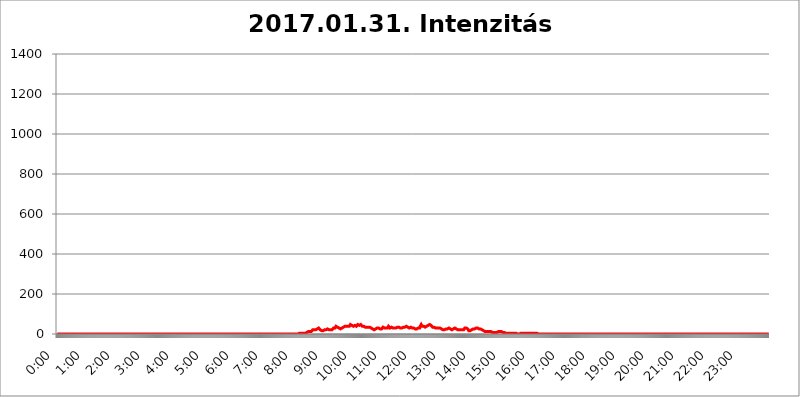
| Category | 2017.01.31. Intenzitás [W/m^2] |
|---|---|
| 0.0 | 0 |
| 0.0006944444444444445 | 0 |
| 0.001388888888888889 | 0 |
| 0.0020833333333333333 | 0 |
| 0.002777777777777778 | 0 |
| 0.003472222222222222 | 0 |
| 0.004166666666666667 | 0 |
| 0.004861111111111111 | 0 |
| 0.005555555555555556 | 0 |
| 0.0062499999999999995 | 0 |
| 0.006944444444444444 | 0 |
| 0.007638888888888889 | 0 |
| 0.008333333333333333 | 0 |
| 0.009027777777777779 | 0 |
| 0.009722222222222222 | 0 |
| 0.010416666666666666 | 0 |
| 0.011111111111111112 | 0 |
| 0.011805555555555555 | 0 |
| 0.012499999999999999 | 0 |
| 0.013194444444444444 | 0 |
| 0.013888888888888888 | 0 |
| 0.014583333333333332 | 0 |
| 0.015277777777777777 | 0 |
| 0.015972222222222224 | 0 |
| 0.016666666666666666 | 0 |
| 0.017361111111111112 | 0 |
| 0.018055555555555557 | 0 |
| 0.01875 | 0 |
| 0.019444444444444445 | 0 |
| 0.02013888888888889 | 0 |
| 0.020833333333333332 | 0 |
| 0.02152777777777778 | 0 |
| 0.022222222222222223 | 0 |
| 0.02291666666666667 | 0 |
| 0.02361111111111111 | 0 |
| 0.024305555555555556 | 0 |
| 0.024999999999999998 | 0 |
| 0.025694444444444447 | 0 |
| 0.02638888888888889 | 0 |
| 0.027083333333333334 | 0 |
| 0.027777777777777776 | 0 |
| 0.02847222222222222 | 0 |
| 0.029166666666666664 | 0 |
| 0.029861111111111113 | 0 |
| 0.030555555555555555 | 0 |
| 0.03125 | 0 |
| 0.03194444444444445 | 0 |
| 0.03263888888888889 | 0 |
| 0.03333333333333333 | 0 |
| 0.034027777777777775 | 0 |
| 0.034722222222222224 | 0 |
| 0.035416666666666666 | 0 |
| 0.036111111111111115 | 0 |
| 0.03680555555555556 | 0 |
| 0.0375 | 0 |
| 0.03819444444444444 | 0 |
| 0.03888888888888889 | 0 |
| 0.03958333333333333 | 0 |
| 0.04027777777777778 | 0 |
| 0.04097222222222222 | 0 |
| 0.041666666666666664 | 0 |
| 0.042361111111111106 | 0 |
| 0.04305555555555556 | 0 |
| 0.043750000000000004 | 0 |
| 0.044444444444444446 | 0 |
| 0.04513888888888889 | 0 |
| 0.04583333333333334 | 0 |
| 0.04652777777777778 | 0 |
| 0.04722222222222222 | 0 |
| 0.04791666666666666 | 0 |
| 0.04861111111111111 | 0 |
| 0.049305555555555554 | 0 |
| 0.049999999999999996 | 0 |
| 0.05069444444444445 | 0 |
| 0.051388888888888894 | 0 |
| 0.052083333333333336 | 0 |
| 0.05277777777777778 | 0 |
| 0.05347222222222222 | 0 |
| 0.05416666666666667 | 0 |
| 0.05486111111111111 | 0 |
| 0.05555555555555555 | 0 |
| 0.05625 | 0 |
| 0.05694444444444444 | 0 |
| 0.057638888888888885 | 0 |
| 0.05833333333333333 | 0 |
| 0.05902777777777778 | 0 |
| 0.059722222222222225 | 0 |
| 0.06041666666666667 | 0 |
| 0.061111111111111116 | 0 |
| 0.06180555555555556 | 0 |
| 0.0625 | 0 |
| 0.06319444444444444 | 0 |
| 0.06388888888888888 | 0 |
| 0.06458333333333334 | 0 |
| 0.06527777777777778 | 0 |
| 0.06597222222222222 | 0 |
| 0.06666666666666667 | 0 |
| 0.06736111111111111 | 0 |
| 0.06805555555555555 | 0 |
| 0.06874999999999999 | 0 |
| 0.06944444444444443 | 0 |
| 0.07013888888888889 | 0 |
| 0.07083333333333333 | 0 |
| 0.07152777777777779 | 0 |
| 0.07222222222222223 | 0 |
| 0.07291666666666667 | 0 |
| 0.07361111111111111 | 0 |
| 0.07430555555555556 | 0 |
| 0.075 | 0 |
| 0.07569444444444444 | 0 |
| 0.0763888888888889 | 0 |
| 0.07708333333333334 | 0 |
| 0.07777777777777778 | 0 |
| 0.07847222222222222 | 0 |
| 0.07916666666666666 | 0 |
| 0.0798611111111111 | 0 |
| 0.08055555555555556 | 0 |
| 0.08125 | 0 |
| 0.08194444444444444 | 0 |
| 0.08263888888888889 | 0 |
| 0.08333333333333333 | 0 |
| 0.08402777777777777 | 0 |
| 0.08472222222222221 | 0 |
| 0.08541666666666665 | 0 |
| 0.08611111111111112 | 0 |
| 0.08680555555555557 | 0 |
| 0.08750000000000001 | 0 |
| 0.08819444444444445 | 0 |
| 0.08888888888888889 | 0 |
| 0.08958333333333333 | 0 |
| 0.09027777777777778 | 0 |
| 0.09097222222222222 | 0 |
| 0.09166666666666667 | 0 |
| 0.09236111111111112 | 0 |
| 0.09305555555555556 | 0 |
| 0.09375 | 0 |
| 0.09444444444444444 | 0 |
| 0.09513888888888888 | 0 |
| 0.09583333333333333 | 0 |
| 0.09652777777777777 | 0 |
| 0.09722222222222222 | 0 |
| 0.09791666666666667 | 0 |
| 0.09861111111111111 | 0 |
| 0.09930555555555555 | 0 |
| 0.09999999999999999 | 0 |
| 0.10069444444444443 | 0 |
| 0.1013888888888889 | 0 |
| 0.10208333333333335 | 0 |
| 0.10277777777777779 | 0 |
| 0.10347222222222223 | 0 |
| 0.10416666666666667 | 0 |
| 0.10486111111111111 | 0 |
| 0.10555555555555556 | 0 |
| 0.10625 | 0 |
| 0.10694444444444444 | 0 |
| 0.1076388888888889 | 0 |
| 0.10833333333333334 | 0 |
| 0.10902777777777778 | 0 |
| 0.10972222222222222 | 0 |
| 0.1111111111111111 | 0 |
| 0.11180555555555556 | 0 |
| 0.11180555555555556 | 0 |
| 0.1125 | 0 |
| 0.11319444444444444 | 0 |
| 0.11388888888888889 | 0 |
| 0.11458333333333333 | 0 |
| 0.11527777777777777 | 0 |
| 0.11597222222222221 | 0 |
| 0.11666666666666665 | 0 |
| 0.1173611111111111 | 0 |
| 0.11805555555555557 | 0 |
| 0.11944444444444445 | 0 |
| 0.12013888888888889 | 0 |
| 0.12083333333333333 | 0 |
| 0.12152777777777778 | 0 |
| 0.12222222222222223 | 0 |
| 0.12291666666666667 | 0 |
| 0.12291666666666667 | 0 |
| 0.12361111111111112 | 0 |
| 0.12430555555555556 | 0 |
| 0.125 | 0 |
| 0.12569444444444444 | 0 |
| 0.12638888888888888 | 0 |
| 0.12708333333333333 | 0 |
| 0.16875 | 0 |
| 0.12847222222222224 | 0 |
| 0.12916666666666668 | 0 |
| 0.12986111111111112 | 0 |
| 0.13055555555555556 | 0 |
| 0.13125 | 0 |
| 0.13194444444444445 | 0 |
| 0.1326388888888889 | 0 |
| 0.13333333333333333 | 0 |
| 0.13402777777777777 | 0 |
| 0.13402777777777777 | 0 |
| 0.13472222222222222 | 0 |
| 0.13541666666666666 | 0 |
| 0.1361111111111111 | 0 |
| 0.13749999999999998 | 0 |
| 0.13819444444444443 | 0 |
| 0.1388888888888889 | 0 |
| 0.13958333333333334 | 0 |
| 0.14027777777777778 | 0 |
| 0.14097222222222222 | 0 |
| 0.14166666666666666 | 0 |
| 0.1423611111111111 | 0 |
| 0.14305555555555557 | 0 |
| 0.14375000000000002 | 0 |
| 0.14444444444444446 | 0 |
| 0.1451388888888889 | 0 |
| 0.1451388888888889 | 0 |
| 0.14652777777777778 | 0 |
| 0.14722222222222223 | 0 |
| 0.14791666666666667 | 0 |
| 0.1486111111111111 | 0 |
| 0.14930555555555555 | 0 |
| 0.15 | 0 |
| 0.15069444444444444 | 0 |
| 0.15138888888888888 | 0 |
| 0.15208333333333332 | 0 |
| 0.15277777777777776 | 0 |
| 0.15347222222222223 | 0 |
| 0.15416666666666667 | 0 |
| 0.15486111111111112 | 0 |
| 0.15555555555555556 | 0 |
| 0.15625 | 0 |
| 0.15694444444444444 | 0 |
| 0.15763888888888888 | 0 |
| 0.15833333333333333 | 0 |
| 0.15902777777777777 | 0 |
| 0.15972222222222224 | 0 |
| 0.16041666666666668 | 0 |
| 0.16111111111111112 | 0 |
| 0.16180555555555556 | 0 |
| 0.1625 | 0 |
| 0.16319444444444445 | 0 |
| 0.1638888888888889 | 0 |
| 0.16458333333333333 | 0 |
| 0.16527777777777777 | 0 |
| 0.16597222222222222 | 0 |
| 0.16666666666666666 | 0 |
| 0.1673611111111111 | 0 |
| 0.16805555555555554 | 0 |
| 0.16874999999999998 | 0 |
| 0.16944444444444443 | 0 |
| 0.17013888888888887 | 0 |
| 0.1708333333333333 | 0 |
| 0.17152777777777775 | 0 |
| 0.17222222222222225 | 0 |
| 0.1729166666666667 | 0 |
| 0.17361111111111113 | 0 |
| 0.17430555555555557 | 0 |
| 0.17500000000000002 | 0 |
| 0.17569444444444446 | 0 |
| 0.1763888888888889 | 0 |
| 0.17708333333333334 | 0 |
| 0.17777777777777778 | 0 |
| 0.17847222222222223 | 0 |
| 0.17916666666666667 | 0 |
| 0.1798611111111111 | 0 |
| 0.18055555555555555 | 0 |
| 0.18125 | 0 |
| 0.18194444444444444 | 0 |
| 0.1826388888888889 | 0 |
| 0.18333333333333335 | 0 |
| 0.1840277777777778 | 0 |
| 0.18472222222222223 | 0 |
| 0.18541666666666667 | 0 |
| 0.18611111111111112 | 0 |
| 0.18680555555555556 | 0 |
| 0.1875 | 0 |
| 0.18819444444444444 | 0 |
| 0.18888888888888888 | 0 |
| 0.18958333333333333 | 0 |
| 0.19027777777777777 | 0 |
| 0.1909722222222222 | 0 |
| 0.19166666666666665 | 0 |
| 0.19236111111111112 | 0 |
| 0.19305555555555554 | 0 |
| 0.19375 | 0 |
| 0.19444444444444445 | 0 |
| 0.1951388888888889 | 0 |
| 0.19583333333333333 | 0 |
| 0.19652777777777777 | 0 |
| 0.19722222222222222 | 0 |
| 0.19791666666666666 | 0 |
| 0.1986111111111111 | 0 |
| 0.19930555555555554 | 0 |
| 0.19999999999999998 | 0 |
| 0.20069444444444443 | 0 |
| 0.20138888888888887 | 0 |
| 0.2020833333333333 | 0 |
| 0.2027777777777778 | 0 |
| 0.2034722222222222 | 0 |
| 0.2041666666666667 | 0 |
| 0.20486111111111113 | 0 |
| 0.20555555555555557 | 0 |
| 0.20625000000000002 | 0 |
| 0.20694444444444446 | 0 |
| 0.2076388888888889 | 0 |
| 0.20833333333333334 | 0 |
| 0.20902777777777778 | 0 |
| 0.20972222222222223 | 0 |
| 0.21041666666666667 | 0 |
| 0.2111111111111111 | 0 |
| 0.21180555555555555 | 0 |
| 0.2125 | 0 |
| 0.21319444444444444 | 0 |
| 0.2138888888888889 | 0 |
| 0.21458333333333335 | 0 |
| 0.2152777777777778 | 0 |
| 0.21597222222222223 | 0 |
| 0.21666666666666667 | 0 |
| 0.21736111111111112 | 0 |
| 0.21805555555555556 | 0 |
| 0.21875 | 0 |
| 0.21944444444444444 | 0 |
| 0.22013888888888888 | 0 |
| 0.22083333333333333 | 0 |
| 0.22152777777777777 | 0 |
| 0.2222222222222222 | 0 |
| 0.22291666666666665 | 0 |
| 0.2236111111111111 | 0 |
| 0.22430555555555556 | 0 |
| 0.225 | 0 |
| 0.22569444444444445 | 0 |
| 0.2263888888888889 | 0 |
| 0.22708333333333333 | 0 |
| 0.22777777777777777 | 0 |
| 0.22847222222222222 | 0 |
| 0.22916666666666666 | 0 |
| 0.2298611111111111 | 0 |
| 0.23055555555555554 | 0 |
| 0.23124999999999998 | 0 |
| 0.23194444444444443 | 0 |
| 0.23263888888888887 | 0 |
| 0.2333333333333333 | 0 |
| 0.2340277777777778 | 0 |
| 0.2347222222222222 | 0 |
| 0.2354166666666667 | 0 |
| 0.23611111111111113 | 0 |
| 0.23680555555555557 | 0 |
| 0.23750000000000002 | 0 |
| 0.23819444444444446 | 0 |
| 0.2388888888888889 | 0 |
| 0.23958333333333334 | 0 |
| 0.24027777777777778 | 0 |
| 0.24097222222222223 | 0 |
| 0.24166666666666667 | 0 |
| 0.2423611111111111 | 0 |
| 0.24305555555555555 | 0 |
| 0.24375 | 0 |
| 0.24444444444444446 | 0 |
| 0.24513888888888888 | 0 |
| 0.24583333333333335 | 0 |
| 0.2465277777777778 | 0 |
| 0.24722222222222223 | 0 |
| 0.24791666666666667 | 0 |
| 0.24861111111111112 | 0 |
| 0.24930555555555556 | 0 |
| 0.25 | 0 |
| 0.25069444444444444 | 0 |
| 0.2513888888888889 | 0 |
| 0.2520833333333333 | 0 |
| 0.25277777777777777 | 0 |
| 0.2534722222222222 | 0 |
| 0.25416666666666665 | 0 |
| 0.2548611111111111 | 0 |
| 0.2555555555555556 | 0 |
| 0.25625000000000003 | 0 |
| 0.2569444444444445 | 0 |
| 0.2576388888888889 | 0 |
| 0.25833333333333336 | 0 |
| 0.2590277777777778 | 0 |
| 0.25972222222222224 | 0 |
| 0.2604166666666667 | 0 |
| 0.2611111111111111 | 0 |
| 0.26180555555555557 | 0 |
| 0.2625 | 0 |
| 0.26319444444444445 | 0 |
| 0.2638888888888889 | 0 |
| 0.26458333333333334 | 0 |
| 0.2652777777777778 | 0 |
| 0.2659722222222222 | 0 |
| 0.26666666666666666 | 0 |
| 0.2673611111111111 | 0 |
| 0.26805555555555555 | 0 |
| 0.26875 | 0 |
| 0.26944444444444443 | 0 |
| 0.2701388888888889 | 0 |
| 0.2708333333333333 | 0 |
| 0.27152777777777776 | 0 |
| 0.2722222222222222 | 0 |
| 0.27291666666666664 | 0 |
| 0.2736111111111111 | 0 |
| 0.2743055555555555 | 0 |
| 0.27499999999999997 | 0 |
| 0.27569444444444446 | 0 |
| 0.27638888888888885 | 0 |
| 0.27708333333333335 | 0 |
| 0.2777777777777778 | 0 |
| 0.27847222222222223 | 0 |
| 0.2791666666666667 | 0 |
| 0.2798611111111111 | 0 |
| 0.28055555555555556 | 0 |
| 0.28125 | 0 |
| 0.28194444444444444 | 0 |
| 0.2826388888888889 | 0 |
| 0.2833333333333333 | 0 |
| 0.28402777777777777 | 0 |
| 0.2847222222222222 | 0 |
| 0.28541666666666665 | 0 |
| 0.28611111111111115 | 0 |
| 0.28680555555555554 | 0 |
| 0.28750000000000003 | 0 |
| 0.2881944444444445 | 0 |
| 0.2888888888888889 | 0 |
| 0.28958333333333336 | 0 |
| 0.2902777777777778 | 0 |
| 0.29097222222222224 | 0 |
| 0.2916666666666667 | 0 |
| 0.2923611111111111 | 0 |
| 0.29305555555555557 | 0 |
| 0.29375 | 0 |
| 0.29444444444444445 | 0 |
| 0.2951388888888889 | 0 |
| 0.29583333333333334 | 0 |
| 0.2965277777777778 | 0 |
| 0.2972222222222222 | 0 |
| 0.29791666666666666 | 0 |
| 0.2986111111111111 | 0 |
| 0.29930555555555555 | 0 |
| 0.3 | 0 |
| 0.30069444444444443 | 0 |
| 0.3013888888888889 | 0 |
| 0.3020833333333333 | 0 |
| 0.30277777777777776 | 0 |
| 0.3034722222222222 | 0 |
| 0.30416666666666664 | 0 |
| 0.3048611111111111 | 0 |
| 0.3055555555555555 | 0 |
| 0.30624999999999997 | 0 |
| 0.3069444444444444 | 0 |
| 0.3076388888888889 | 0 |
| 0.30833333333333335 | 0 |
| 0.3090277777777778 | 0 |
| 0.30972222222222223 | 0 |
| 0.3104166666666667 | 0 |
| 0.3111111111111111 | 0 |
| 0.31180555555555556 | 0 |
| 0.3125 | 0 |
| 0.31319444444444444 | 0 |
| 0.3138888888888889 | 0 |
| 0.3145833333333333 | 0 |
| 0.31527777777777777 | 0 |
| 0.3159722222222222 | 0 |
| 0.31666666666666665 | 0 |
| 0.31736111111111115 | 0 |
| 0.31805555555555554 | 0 |
| 0.31875000000000003 | 0 |
| 0.3194444444444445 | 0 |
| 0.3201388888888889 | 0 |
| 0.32083333333333336 | 0 |
| 0.3215277777777778 | 0 |
| 0.32222222222222224 | 0 |
| 0.3229166666666667 | 0 |
| 0.3236111111111111 | 0 |
| 0.32430555555555557 | 0 |
| 0.325 | 0 |
| 0.32569444444444445 | 0 |
| 0.3263888888888889 | 0 |
| 0.32708333333333334 | 0 |
| 0.3277777777777778 | 0 |
| 0.3284722222222222 | 0 |
| 0.32916666666666666 | 0 |
| 0.3298611111111111 | 0 |
| 0.33055555555555555 | 0 |
| 0.33125 | 0 |
| 0.33194444444444443 | 0 |
| 0.3326388888888889 | 0 |
| 0.3333333333333333 | 0 |
| 0.3340277777777778 | 0 |
| 0.3347222222222222 | 0 |
| 0.3354166666666667 | 0 |
| 0.3361111111111111 | 0 |
| 0.3368055555555556 | 0 |
| 0.33749999999999997 | 0 |
| 0.33819444444444446 | 0 |
| 0.33888888888888885 | 0 |
| 0.33958333333333335 | 3.525 |
| 0.34027777777777773 | 3.525 |
| 0.34097222222222223 | 3.525 |
| 0.3416666666666666 | 3.525 |
| 0.3423611111111111 | 3.525 |
| 0.3430555555555555 | 3.525 |
| 0.34375 | 3.525 |
| 0.3444444444444445 | 3.525 |
| 0.3451388888888889 | 3.525 |
| 0.3458333333333334 | 3.525 |
| 0.34652777777777777 | 3.525 |
| 0.34722222222222227 | 3.525 |
| 0.34791666666666665 | 3.525 |
| 0.34861111111111115 | 7.887 |
| 0.34930555555555554 | 7.887 |
| 0.35000000000000003 | 7.887 |
| 0.3506944444444444 | 12.257 |
| 0.3513888888888889 | 12.257 |
| 0.3520833333333333 | 12.257 |
| 0.3527777777777778 | 12.257 |
| 0.3534722222222222 | 12.257 |
| 0.3541666666666667 | 12.257 |
| 0.3548611111111111 | 12.257 |
| 0.35555555555555557 | 12.257 |
| 0.35625 | 12.257 |
| 0.35694444444444445 | 12.257 |
| 0.3576388888888889 | 16.636 |
| 0.35833333333333334 | 21.024 |
| 0.3590277777777778 | 21.024 |
| 0.3597222222222222 | 21.024 |
| 0.36041666666666666 | 21.024 |
| 0.3611111111111111 | 21.024 |
| 0.36180555555555555 | 21.024 |
| 0.3625 | 21.024 |
| 0.36319444444444443 | 21.024 |
| 0.3638888888888889 | 25.419 |
| 0.3645833333333333 | 25.419 |
| 0.3652777777777778 | 25.419 |
| 0.3659722222222222 | 25.419 |
| 0.3666666666666667 | 29.823 |
| 0.3673611111111111 | 29.823 |
| 0.3680555555555556 | 25.419 |
| 0.36874999999999997 | 21.024 |
| 0.36944444444444446 | 16.636 |
| 0.37013888888888885 | 16.636 |
| 0.37083333333333335 | 16.636 |
| 0.37152777777777773 | 16.636 |
| 0.37222222222222223 | 16.636 |
| 0.3729166666666666 | 16.636 |
| 0.3736111111111111 | 16.636 |
| 0.3743055555555555 | 21.024 |
| 0.375 | 21.024 |
| 0.3756944444444445 | 21.024 |
| 0.3763888888888889 | 21.024 |
| 0.3770833333333334 | 21.024 |
| 0.37777777777777777 | 25.419 |
| 0.37847222222222227 | 25.419 |
| 0.37916666666666665 | 25.419 |
| 0.37986111111111115 | 21.024 |
| 0.38055555555555554 | 21.024 |
| 0.38125000000000003 | 21.024 |
| 0.3819444444444444 | 21.024 |
| 0.3826388888888889 | 21.024 |
| 0.3833333333333333 | 21.024 |
| 0.3840277777777778 | 21.024 |
| 0.3847222222222222 | 21.024 |
| 0.3854166666666667 | 21.024 |
| 0.3861111111111111 | 21.024 |
| 0.38680555555555557 | 25.419 |
| 0.3875 | 29.823 |
| 0.38819444444444445 | 29.823 |
| 0.3888888888888889 | 29.823 |
| 0.38958333333333334 | 29.823 |
| 0.3902777777777778 | 34.234 |
| 0.3909722222222222 | 38.653 |
| 0.39166666666666666 | 38.653 |
| 0.3923611111111111 | 38.653 |
| 0.39305555555555555 | 34.234 |
| 0.39375 | 34.234 |
| 0.39444444444444443 | 34.234 |
| 0.3951388888888889 | 29.823 |
| 0.3958333333333333 | 29.823 |
| 0.3965277777777778 | 25.419 |
| 0.3972222222222222 | 25.419 |
| 0.3979166666666667 | 29.823 |
| 0.3986111111111111 | 29.823 |
| 0.3993055555555556 | 29.823 |
| 0.39999999999999997 | 34.234 |
| 0.40069444444444446 | 34.234 |
| 0.40138888888888885 | 34.234 |
| 0.40208333333333335 | 38.653 |
| 0.40277777777777773 | 38.653 |
| 0.40347222222222223 | 38.653 |
| 0.4041666666666666 | 38.653 |
| 0.4048611111111111 | 38.653 |
| 0.4055555555555555 | 38.653 |
| 0.40625 | 38.653 |
| 0.4069444444444445 | 38.653 |
| 0.4076388888888889 | 38.653 |
| 0.4083333333333334 | 43.079 |
| 0.40902777777777777 | 38.653 |
| 0.40972222222222227 | 38.653 |
| 0.41041666666666665 | 43.079 |
| 0.41111111111111115 | 47.511 |
| 0.41180555555555554 | 47.511 |
| 0.41250000000000003 | 47.511 |
| 0.4131944444444444 | 43.079 |
| 0.4138888888888889 | 43.079 |
| 0.4145833333333333 | 38.653 |
| 0.4152777777777778 | 38.653 |
| 0.4159722222222222 | 43.079 |
| 0.4166666666666667 | 43.079 |
| 0.4173611111111111 | 43.079 |
| 0.41805555555555557 | 43.079 |
| 0.41875 | 38.653 |
| 0.41944444444444445 | 38.653 |
| 0.4201388888888889 | 43.079 |
| 0.42083333333333334 | 43.079 |
| 0.4215277777777778 | 47.511 |
| 0.4222222222222222 | 47.511 |
| 0.42291666666666666 | 47.511 |
| 0.4236111111111111 | 43.079 |
| 0.42430555555555555 | 47.511 |
| 0.425 | 43.079 |
| 0.42569444444444443 | 47.511 |
| 0.4263888888888889 | 47.511 |
| 0.4270833333333333 | 43.079 |
| 0.4277777777777778 | 38.653 |
| 0.4284722222222222 | 38.653 |
| 0.4291666666666667 | 38.653 |
| 0.4298611111111111 | 38.653 |
| 0.4305555555555556 | 38.653 |
| 0.43124999999999997 | 34.234 |
| 0.43194444444444446 | 34.234 |
| 0.43263888888888885 | 34.234 |
| 0.43333333333333335 | 34.234 |
| 0.43402777777777773 | 34.234 |
| 0.43472222222222223 | 34.234 |
| 0.4354166666666666 | 34.234 |
| 0.4361111111111111 | 34.234 |
| 0.4368055555555555 | 29.823 |
| 0.4375 | 29.823 |
| 0.4381944444444445 | 34.234 |
| 0.4388888888888889 | 34.234 |
| 0.4395833333333334 | 29.823 |
| 0.44027777777777777 | 29.823 |
| 0.44097222222222227 | 29.823 |
| 0.44166666666666665 | 25.419 |
| 0.44236111111111115 | 25.419 |
| 0.44305555555555554 | 21.024 |
| 0.44375000000000003 | 21.024 |
| 0.4444444444444444 | 21.024 |
| 0.4451388888888889 | 21.024 |
| 0.4458333333333333 | 21.024 |
| 0.4465277777777778 | 25.419 |
| 0.4472222222222222 | 29.823 |
| 0.4479166666666667 | 29.823 |
| 0.4486111111111111 | 29.823 |
| 0.44930555555555557 | 29.823 |
| 0.45 | 29.823 |
| 0.45069444444444445 | 29.823 |
| 0.4513888888888889 | 25.419 |
| 0.45208333333333334 | 25.419 |
| 0.4527777777777778 | 25.419 |
| 0.4534722222222222 | 25.419 |
| 0.45416666666666666 | 25.419 |
| 0.4548611111111111 | 25.419 |
| 0.45555555555555555 | 29.823 |
| 0.45625 | 29.823 |
| 0.45694444444444443 | 34.234 |
| 0.4576388888888889 | 29.823 |
| 0.4583333333333333 | 29.823 |
| 0.4590277777777778 | 29.823 |
| 0.4597222222222222 | 29.823 |
| 0.4604166666666667 | 29.823 |
| 0.4611111111111111 | 29.823 |
| 0.4618055555555556 | 29.823 |
| 0.46249999999999997 | 29.823 |
| 0.46319444444444446 | 29.823 |
| 0.46388888888888885 | 34.234 |
| 0.46458333333333335 | 38.653 |
| 0.46527777777777773 | 38.653 |
| 0.46597222222222223 | 34.234 |
| 0.4666666666666666 | 29.823 |
| 0.4673611111111111 | 29.823 |
| 0.4680555555555555 | 34.234 |
| 0.46875 | 34.234 |
| 0.4694444444444445 | 34.234 |
| 0.4701388888888889 | 34.234 |
| 0.4708333333333334 | 29.823 |
| 0.47152777777777777 | 29.823 |
| 0.47222222222222227 | 29.823 |
| 0.47291666666666665 | 29.823 |
| 0.47361111111111115 | 29.823 |
| 0.47430555555555554 | 29.823 |
| 0.47500000000000003 | 29.823 |
| 0.4756944444444444 | 34.234 |
| 0.4763888888888889 | 34.234 |
| 0.4770833333333333 | 34.234 |
| 0.4777777777777778 | 34.234 |
| 0.4784722222222222 | 29.823 |
| 0.4791666666666667 | 34.234 |
| 0.4798611111111111 | 34.234 |
| 0.48055555555555557 | 29.823 |
| 0.48125 | 29.823 |
| 0.48194444444444445 | 29.823 |
| 0.4826388888888889 | 29.823 |
| 0.48333333333333334 | 29.823 |
| 0.4840277777777778 | 29.823 |
| 0.4847222222222222 | 29.823 |
| 0.48541666666666666 | 34.234 |
| 0.4861111111111111 | 34.234 |
| 0.48680555555555555 | 34.234 |
| 0.4875 | 34.234 |
| 0.48819444444444443 | 34.234 |
| 0.4888888888888889 | 34.234 |
| 0.4895833333333333 | 38.653 |
| 0.4902777777777778 | 34.234 |
| 0.4909722222222222 | 34.234 |
| 0.4916666666666667 | 34.234 |
| 0.4923611111111111 | 29.823 |
| 0.4930555555555556 | 29.823 |
| 0.49374999999999997 | 29.823 |
| 0.49444444444444446 | 29.823 |
| 0.49513888888888885 | 29.823 |
| 0.49583333333333335 | 34.234 |
| 0.49652777777777773 | 34.234 |
| 0.49722222222222223 | 29.823 |
| 0.4979166666666666 | 29.823 |
| 0.4986111111111111 | 29.823 |
| 0.4993055555555555 | 29.823 |
| 0.5 | 29.823 |
| 0.5006944444444444 | 29.823 |
| 0.5013888888888889 | 25.419 |
| 0.5020833333333333 | 25.419 |
| 0.5027777777777778 | 25.419 |
| 0.5034722222222222 | 25.419 |
| 0.5041666666666667 | 25.419 |
| 0.5048611111111111 | 25.419 |
| 0.5055555555555555 | 25.419 |
| 0.50625 | 29.823 |
| 0.5069444444444444 | 29.823 |
| 0.5076388888888889 | 29.823 |
| 0.5083333333333333 | 29.823 |
| 0.5090277777777777 | 38.653 |
| 0.5097222222222222 | 38.653 |
| 0.5104166666666666 | 47.511 |
| 0.5111111111111112 | 47.511 |
| 0.5118055555555555 | 38.653 |
| 0.5125000000000001 | 43.079 |
| 0.5131944444444444 | 43.079 |
| 0.513888888888889 | 38.653 |
| 0.5145833333333333 | 38.653 |
| 0.5152777777777778 | 38.653 |
| 0.5159722222222222 | 34.234 |
| 0.5166666666666667 | 34.234 |
| 0.517361111111111 | 34.234 |
| 0.5180555555555556 | 38.653 |
| 0.5187499999999999 | 38.653 |
| 0.5194444444444445 | 43.079 |
| 0.5201388888888888 | 43.079 |
| 0.5208333333333334 | 47.511 |
| 0.5215277777777778 | 47.511 |
| 0.5222222222222223 | 47.511 |
| 0.5229166666666667 | 43.079 |
| 0.5236111111111111 | 43.079 |
| 0.5243055555555556 | 43.079 |
| 0.525 | 38.653 |
| 0.5256944444444445 | 38.653 |
| 0.5263888888888889 | 34.234 |
| 0.5270833333333333 | 34.234 |
| 0.5277777777777778 | 34.234 |
| 0.5284722222222222 | 34.234 |
| 0.5291666666666667 | 34.234 |
| 0.5298611111111111 | 34.234 |
| 0.5305555555555556 | 29.823 |
| 0.53125 | 29.823 |
| 0.5319444444444444 | 29.823 |
| 0.5326388888888889 | 29.823 |
| 0.5333333333333333 | 25.419 |
| 0.5340277777777778 | 29.823 |
| 0.5347222222222222 | 29.823 |
| 0.5354166666666667 | 29.823 |
| 0.5361111111111111 | 29.823 |
| 0.5368055555555555 | 29.823 |
| 0.5375 | 29.823 |
| 0.5381944444444444 | 29.823 |
| 0.5388888888888889 | 25.419 |
| 0.5395833333333333 | 25.419 |
| 0.5402777777777777 | 25.419 |
| 0.5409722222222222 | 21.024 |
| 0.5416666666666666 | 21.024 |
| 0.5423611111111112 | 21.024 |
| 0.5430555555555555 | 21.024 |
| 0.5437500000000001 | 21.024 |
| 0.5444444444444444 | 21.024 |
| 0.545138888888889 | 25.419 |
| 0.5458333333333333 | 25.419 |
| 0.5465277777777778 | 25.419 |
| 0.5472222222222222 | 25.419 |
| 0.5479166666666667 | 25.419 |
| 0.548611111111111 | 25.419 |
| 0.5493055555555556 | 29.823 |
| 0.5499999999999999 | 29.823 |
| 0.5506944444444445 | 25.419 |
| 0.5513888888888888 | 25.419 |
| 0.5520833333333334 | 21.024 |
| 0.5527777777777778 | 21.024 |
| 0.5534722222222223 | 21.024 |
| 0.5541666666666667 | 21.024 |
| 0.5548611111111111 | 21.024 |
| 0.5555555555555556 | 25.419 |
| 0.55625 | 29.823 |
| 0.5569444444444445 | 29.823 |
| 0.5576388888888889 | 29.823 |
| 0.5583333333333333 | 29.823 |
| 0.5590277777777778 | 29.823 |
| 0.5597222222222222 | 25.419 |
| 0.5604166666666667 | 25.419 |
| 0.5611111111111111 | 21.024 |
| 0.5618055555555556 | 21.024 |
| 0.5625 | 21.024 |
| 0.5631944444444444 | 21.024 |
| 0.5638888888888889 | 21.024 |
| 0.5645833333333333 | 25.419 |
| 0.5652777777777778 | 25.419 |
| 0.5659722222222222 | 21.024 |
| 0.5666666666666667 | 21.024 |
| 0.5673611111111111 | 21.024 |
| 0.5680555555555555 | 21.024 |
| 0.56875 | 21.024 |
| 0.5694444444444444 | 21.024 |
| 0.5701388888888889 | 21.024 |
| 0.5708333333333333 | 25.419 |
| 0.5715277777777777 | 29.823 |
| 0.5722222222222222 | 29.823 |
| 0.5729166666666666 | 29.823 |
| 0.5736111111111112 | 29.823 |
| 0.5743055555555555 | 29.823 |
| 0.5750000000000001 | 25.419 |
| 0.5756944444444444 | 25.419 |
| 0.576388888888889 | 21.024 |
| 0.5770833333333333 | 16.636 |
| 0.5777777777777778 | 16.636 |
| 0.5784722222222222 | 16.636 |
| 0.5791666666666667 | 16.636 |
| 0.579861111111111 | 16.636 |
| 0.5805555555555556 | 21.024 |
| 0.5812499999999999 | 21.024 |
| 0.5819444444444445 | 25.419 |
| 0.5826388888888888 | 25.419 |
| 0.5833333333333334 | 25.419 |
| 0.5840277777777778 | 29.823 |
| 0.5847222222222223 | 29.823 |
| 0.5854166666666667 | 25.419 |
| 0.5861111111111111 | 25.419 |
| 0.5868055555555556 | 25.419 |
| 0.5875 | 29.823 |
| 0.5881944444444445 | 29.823 |
| 0.5888888888888889 | 29.823 |
| 0.5895833333333333 | 29.823 |
| 0.5902777777777778 | 25.419 |
| 0.5909722222222222 | 25.419 |
| 0.5916666666666667 | 25.419 |
| 0.5923611111111111 | 25.419 |
| 0.5930555555555556 | 25.419 |
| 0.59375 | 25.419 |
| 0.5944444444444444 | 21.024 |
| 0.5951388888888889 | 21.024 |
| 0.5958333333333333 | 21.024 |
| 0.5965277777777778 | 21.024 |
| 0.5972222222222222 | 16.636 |
| 0.5979166666666667 | 16.636 |
| 0.5986111111111111 | 16.636 |
| 0.5993055555555555 | 16.636 |
| 0.6 | 12.257 |
| 0.6006944444444444 | 12.257 |
| 0.6013888888888889 | 12.257 |
| 0.6020833333333333 | 12.257 |
| 0.6027777777777777 | 12.257 |
| 0.6034722222222222 | 12.257 |
| 0.6041666666666666 | 12.257 |
| 0.6048611111111112 | 12.257 |
| 0.6055555555555555 | 12.257 |
| 0.6062500000000001 | 12.257 |
| 0.6069444444444444 | 12.257 |
| 0.607638888888889 | 12.257 |
| 0.6083333333333333 | 12.257 |
| 0.6090277777777778 | 7.887 |
| 0.6097222222222222 | 7.887 |
| 0.6104166666666667 | 7.887 |
| 0.611111111111111 | 7.887 |
| 0.6118055555555556 | 7.887 |
| 0.6124999999999999 | 7.887 |
| 0.6131944444444445 | 7.887 |
| 0.6138888888888888 | 7.887 |
| 0.6145833333333334 | 7.887 |
| 0.6152777777777778 | 7.887 |
| 0.6159722222222223 | 7.887 |
| 0.6166666666666667 | 7.887 |
| 0.6173611111111111 | 7.887 |
| 0.6180555555555556 | 12.257 |
| 0.61875 | 12.257 |
| 0.6194444444444445 | 12.257 |
| 0.6201388888888889 | 12.257 |
| 0.6208333333333333 | 12.257 |
| 0.6215277777777778 | 12.257 |
| 0.6222222222222222 | 12.257 |
| 0.6229166666666667 | 12.257 |
| 0.6236111111111111 | 7.887 |
| 0.6243055555555556 | 7.887 |
| 0.625 | 7.887 |
| 0.6256944444444444 | 7.887 |
| 0.6263888888888889 | 7.887 |
| 0.6270833333333333 | 7.887 |
| 0.6277777777777778 | 3.525 |
| 0.6284722222222222 | 3.525 |
| 0.6291666666666667 | 3.525 |
| 0.6298611111111111 | 3.525 |
| 0.6305555555555555 | 3.525 |
| 0.63125 | 3.525 |
| 0.6319444444444444 | 3.525 |
| 0.6326388888888889 | 3.525 |
| 0.6333333333333333 | 3.525 |
| 0.6340277777777777 | 3.525 |
| 0.6347222222222222 | 3.525 |
| 0.6354166666666666 | 3.525 |
| 0.6361111111111112 | 3.525 |
| 0.6368055555555555 | 3.525 |
| 0.6375000000000001 | 3.525 |
| 0.6381944444444444 | 3.525 |
| 0.638888888888889 | 3.525 |
| 0.6395833333333333 | 3.525 |
| 0.6402777777777778 | 3.525 |
| 0.6409722222222222 | 3.525 |
| 0.6416666666666667 | 3.525 |
| 0.642361111111111 | 3.525 |
| 0.6430555555555556 | 3.525 |
| 0.6437499999999999 | 3.525 |
| 0.6444444444444445 | 3.525 |
| 0.6451388888888888 | 3.525 |
| 0.6458333333333334 | 0 |
| 0.6465277777777778 | 3.525 |
| 0.6472222222222223 | 0 |
| 0.6479166666666667 | 0 |
| 0.6486111111111111 | 0 |
| 0.6493055555555556 | 3.525 |
| 0.65 | 3.525 |
| 0.6506944444444445 | 3.525 |
| 0.6513888888888889 | 3.525 |
| 0.6520833333333333 | 3.525 |
| 0.6527777777777778 | 3.525 |
| 0.6534722222222222 | 0 |
| 0.6541666666666667 | 3.525 |
| 0.6548611111111111 | 3.525 |
| 0.6555555555555556 | 3.525 |
| 0.65625 | 3.525 |
| 0.6569444444444444 | 3.525 |
| 0.6576388888888889 | 3.525 |
| 0.6583333333333333 | 3.525 |
| 0.6590277777777778 | 3.525 |
| 0.6597222222222222 | 3.525 |
| 0.6604166666666667 | 3.525 |
| 0.6611111111111111 | 3.525 |
| 0.6618055555555555 | 3.525 |
| 0.6625 | 3.525 |
| 0.6631944444444444 | 3.525 |
| 0.6638888888888889 | 3.525 |
| 0.6645833333333333 | 3.525 |
| 0.6652777777777777 | 3.525 |
| 0.6659722222222222 | 3.525 |
| 0.6666666666666666 | 3.525 |
| 0.6673611111111111 | 3.525 |
| 0.6680555555555556 | 3.525 |
| 0.6687500000000001 | 3.525 |
| 0.6694444444444444 | 3.525 |
| 0.6701388888888888 | 3.525 |
| 0.6708333333333334 | 3.525 |
| 0.6715277777777778 | 3.525 |
| 0.6722222222222222 | 3.525 |
| 0.6729166666666666 | 3.525 |
| 0.6736111111111112 | 3.525 |
| 0.6743055555555556 | 0 |
| 0.6749999999999999 | 0 |
| 0.6756944444444444 | 0 |
| 0.6763888888888889 | 0 |
| 0.6770833333333334 | 0 |
| 0.6777777777777777 | 0 |
| 0.6784722222222223 | 0 |
| 0.6791666666666667 | 0 |
| 0.6798611111111111 | 0 |
| 0.6805555555555555 | 0 |
| 0.68125 | 0 |
| 0.6819444444444445 | 0 |
| 0.6826388888888889 | 0 |
| 0.6833333333333332 | 0 |
| 0.6840277777777778 | 0 |
| 0.6847222222222222 | 0 |
| 0.6854166666666667 | 0 |
| 0.686111111111111 | 0 |
| 0.6868055555555556 | 0 |
| 0.6875 | 0 |
| 0.6881944444444444 | 0 |
| 0.688888888888889 | 0 |
| 0.6895833333333333 | 0 |
| 0.6902777777777778 | 0 |
| 0.6909722222222222 | 0 |
| 0.6916666666666668 | 0 |
| 0.6923611111111111 | 0 |
| 0.6930555555555555 | 0 |
| 0.69375 | 0 |
| 0.6944444444444445 | 0 |
| 0.6951388888888889 | 0 |
| 0.6958333333333333 | 0 |
| 0.6965277777777777 | 0 |
| 0.6972222222222223 | 0 |
| 0.6979166666666666 | 0 |
| 0.6986111111111111 | 0 |
| 0.6993055555555556 | 0 |
| 0.7000000000000001 | 0 |
| 0.7006944444444444 | 0 |
| 0.7013888888888888 | 0 |
| 0.7020833333333334 | 0 |
| 0.7027777777777778 | 0 |
| 0.7034722222222222 | 0 |
| 0.7041666666666666 | 0 |
| 0.7048611111111112 | 0 |
| 0.7055555555555556 | 0 |
| 0.7062499999999999 | 0 |
| 0.7069444444444444 | 0 |
| 0.7076388888888889 | 0 |
| 0.7083333333333334 | 0 |
| 0.7090277777777777 | 0 |
| 0.7097222222222223 | 0 |
| 0.7104166666666667 | 0 |
| 0.7111111111111111 | 0 |
| 0.7118055555555555 | 0 |
| 0.7125 | 0 |
| 0.7131944444444445 | 0 |
| 0.7138888888888889 | 0 |
| 0.7145833333333332 | 0 |
| 0.7152777777777778 | 0 |
| 0.7159722222222222 | 0 |
| 0.7166666666666667 | 0 |
| 0.717361111111111 | 0 |
| 0.7180555555555556 | 0 |
| 0.71875 | 0 |
| 0.7194444444444444 | 0 |
| 0.720138888888889 | 0 |
| 0.7208333333333333 | 0 |
| 0.7215277777777778 | 0 |
| 0.7222222222222222 | 0 |
| 0.7229166666666668 | 0 |
| 0.7236111111111111 | 0 |
| 0.7243055555555555 | 0 |
| 0.725 | 0 |
| 0.7256944444444445 | 0 |
| 0.7263888888888889 | 0 |
| 0.7270833333333333 | 0 |
| 0.7277777777777777 | 0 |
| 0.7284722222222223 | 0 |
| 0.7291666666666666 | 0 |
| 0.7298611111111111 | 0 |
| 0.7305555555555556 | 0 |
| 0.7312500000000001 | 0 |
| 0.7319444444444444 | 0 |
| 0.7326388888888888 | 0 |
| 0.7333333333333334 | 0 |
| 0.7340277777777778 | 0 |
| 0.7347222222222222 | 0 |
| 0.7354166666666666 | 0 |
| 0.7361111111111112 | 0 |
| 0.7368055555555556 | 0 |
| 0.7374999999999999 | 0 |
| 0.7381944444444444 | 0 |
| 0.7388888888888889 | 0 |
| 0.7395833333333334 | 0 |
| 0.7402777777777777 | 0 |
| 0.7409722222222223 | 0 |
| 0.7416666666666667 | 0 |
| 0.7423611111111111 | 0 |
| 0.7430555555555555 | 0 |
| 0.74375 | 0 |
| 0.7444444444444445 | 0 |
| 0.7451388888888889 | 0 |
| 0.7458333333333332 | 0 |
| 0.7465277777777778 | 0 |
| 0.7472222222222222 | 0 |
| 0.7479166666666667 | 0 |
| 0.748611111111111 | 0 |
| 0.7493055555555556 | 0 |
| 0.75 | 0 |
| 0.7506944444444444 | 0 |
| 0.751388888888889 | 0 |
| 0.7520833333333333 | 0 |
| 0.7527777777777778 | 0 |
| 0.7534722222222222 | 0 |
| 0.7541666666666668 | 0 |
| 0.7548611111111111 | 0 |
| 0.7555555555555555 | 0 |
| 0.75625 | 0 |
| 0.7569444444444445 | 0 |
| 0.7576388888888889 | 0 |
| 0.7583333333333333 | 0 |
| 0.7590277777777777 | 0 |
| 0.7597222222222223 | 0 |
| 0.7604166666666666 | 0 |
| 0.7611111111111111 | 0 |
| 0.7618055555555556 | 0 |
| 0.7625000000000001 | 0 |
| 0.7631944444444444 | 0 |
| 0.7638888888888888 | 0 |
| 0.7645833333333334 | 0 |
| 0.7652777777777778 | 0 |
| 0.7659722222222222 | 0 |
| 0.7666666666666666 | 0 |
| 0.7673611111111112 | 0 |
| 0.7680555555555556 | 0 |
| 0.7687499999999999 | 0 |
| 0.7694444444444444 | 0 |
| 0.7701388888888889 | 0 |
| 0.7708333333333334 | 0 |
| 0.7715277777777777 | 0 |
| 0.7722222222222223 | 0 |
| 0.7729166666666667 | 0 |
| 0.7736111111111111 | 0 |
| 0.7743055555555555 | 0 |
| 0.775 | 0 |
| 0.7756944444444445 | 0 |
| 0.7763888888888889 | 0 |
| 0.7770833333333332 | 0 |
| 0.7777777777777778 | 0 |
| 0.7784722222222222 | 0 |
| 0.7791666666666667 | 0 |
| 0.779861111111111 | 0 |
| 0.7805555555555556 | 0 |
| 0.78125 | 0 |
| 0.7819444444444444 | 0 |
| 0.782638888888889 | 0 |
| 0.7833333333333333 | 0 |
| 0.7840277777777778 | 0 |
| 0.7847222222222222 | 0 |
| 0.7854166666666668 | 0 |
| 0.7861111111111111 | 0 |
| 0.7868055555555555 | 0 |
| 0.7875 | 0 |
| 0.7881944444444445 | 0 |
| 0.7888888888888889 | 0 |
| 0.7895833333333333 | 0 |
| 0.7902777777777777 | 0 |
| 0.7909722222222223 | 0 |
| 0.7916666666666666 | 0 |
| 0.7923611111111111 | 0 |
| 0.7930555555555556 | 0 |
| 0.7937500000000001 | 0 |
| 0.7944444444444444 | 0 |
| 0.7951388888888888 | 0 |
| 0.7958333333333334 | 0 |
| 0.7965277777777778 | 0 |
| 0.7972222222222222 | 0 |
| 0.7979166666666666 | 0 |
| 0.7986111111111112 | 0 |
| 0.7993055555555556 | 0 |
| 0.7999999999999999 | 0 |
| 0.8006944444444444 | 0 |
| 0.8013888888888889 | 0 |
| 0.8020833333333334 | 0 |
| 0.8027777777777777 | 0 |
| 0.8034722222222223 | 0 |
| 0.8041666666666667 | 0 |
| 0.8048611111111111 | 0 |
| 0.8055555555555555 | 0 |
| 0.80625 | 0 |
| 0.8069444444444445 | 0 |
| 0.8076388888888889 | 0 |
| 0.8083333333333332 | 0 |
| 0.8090277777777778 | 0 |
| 0.8097222222222222 | 0 |
| 0.8104166666666667 | 0 |
| 0.811111111111111 | 0 |
| 0.8118055555555556 | 0 |
| 0.8125 | 0 |
| 0.8131944444444444 | 0 |
| 0.813888888888889 | 0 |
| 0.8145833333333333 | 0 |
| 0.8152777777777778 | 0 |
| 0.8159722222222222 | 0 |
| 0.8166666666666668 | 0 |
| 0.8173611111111111 | 0 |
| 0.8180555555555555 | 0 |
| 0.81875 | 0 |
| 0.8194444444444445 | 0 |
| 0.8201388888888889 | 0 |
| 0.8208333333333333 | 0 |
| 0.8215277777777777 | 0 |
| 0.8222222222222223 | 0 |
| 0.8229166666666666 | 0 |
| 0.8236111111111111 | 0 |
| 0.8243055555555556 | 0 |
| 0.8250000000000001 | 0 |
| 0.8256944444444444 | 0 |
| 0.8263888888888888 | 0 |
| 0.8270833333333334 | 0 |
| 0.8277777777777778 | 0 |
| 0.8284722222222222 | 0 |
| 0.8291666666666666 | 0 |
| 0.8298611111111112 | 0 |
| 0.8305555555555556 | 0 |
| 0.8312499999999999 | 0 |
| 0.8319444444444444 | 0 |
| 0.8326388888888889 | 0 |
| 0.8333333333333334 | 0 |
| 0.8340277777777777 | 0 |
| 0.8347222222222223 | 0 |
| 0.8354166666666667 | 0 |
| 0.8361111111111111 | 0 |
| 0.8368055555555555 | 0 |
| 0.8375 | 0 |
| 0.8381944444444445 | 0 |
| 0.8388888888888889 | 0 |
| 0.8395833333333332 | 0 |
| 0.8402777777777778 | 0 |
| 0.8409722222222222 | 0 |
| 0.8416666666666667 | 0 |
| 0.842361111111111 | 0 |
| 0.8430555555555556 | 0 |
| 0.84375 | 0 |
| 0.8444444444444444 | 0 |
| 0.845138888888889 | 0 |
| 0.8458333333333333 | 0 |
| 0.8465277777777778 | 0 |
| 0.8472222222222222 | 0 |
| 0.8479166666666668 | 0 |
| 0.8486111111111111 | 0 |
| 0.8493055555555555 | 0 |
| 0.85 | 0 |
| 0.8506944444444445 | 0 |
| 0.8513888888888889 | 0 |
| 0.8520833333333333 | 0 |
| 0.8527777777777777 | 0 |
| 0.8534722222222223 | 0 |
| 0.8541666666666666 | 0 |
| 0.8548611111111111 | 0 |
| 0.8555555555555556 | 0 |
| 0.8562500000000001 | 0 |
| 0.8569444444444444 | 0 |
| 0.8576388888888888 | 0 |
| 0.8583333333333334 | 0 |
| 0.8590277777777778 | 0 |
| 0.8597222222222222 | 0 |
| 0.8604166666666666 | 0 |
| 0.8611111111111112 | 0 |
| 0.8618055555555556 | 0 |
| 0.8624999999999999 | 0 |
| 0.8631944444444444 | 0 |
| 0.8638888888888889 | 0 |
| 0.8645833333333334 | 0 |
| 0.8652777777777777 | 0 |
| 0.8659722222222223 | 0 |
| 0.8666666666666667 | 0 |
| 0.8673611111111111 | 0 |
| 0.8680555555555555 | 0 |
| 0.86875 | 0 |
| 0.8694444444444445 | 0 |
| 0.8701388888888889 | 0 |
| 0.8708333333333332 | 0 |
| 0.8715277777777778 | 0 |
| 0.8722222222222222 | 0 |
| 0.8729166666666667 | 0 |
| 0.873611111111111 | 0 |
| 0.8743055555555556 | 0 |
| 0.875 | 0 |
| 0.8756944444444444 | 0 |
| 0.876388888888889 | 0 |
| 0.8770833333333333 | 0 |
| 0.8777777777777778 | 0 |
| 0.8784722222222222 | 0 |
| 0.8791666666666668 | 0 |
| 0.8798611111111111 | 0 |
| 0.8805555555555555 | 0 |
| 0.88125 | 0 |
| 0.8819444444444445 | 0 |
| 0.8826388888888889 | 0 |
| 0.8833333333333333 | 0 |
| 0.8840277777777777 | 0 |
| 0.8847222222222223 | 0 |
| 0.8854166666666666 | 0 |
| 0.8861111111111111 | 0 |
| 0.8868055555555556 | 0 |
| 0.8875000000000001 | 0 |
| 0.8881944444444444 | 0 |
| 0.8888888888888888 | 0 |
| 0.8895833333333334 | 0 |
| 0.8902777777777778 | 0 |
| 0.8909722222222222 | 0 |
| 0.8916666666666666 | 0 |
| 0.8923611111111112 | 0 |
| 0.8930555555555556 | 0 |
| 0.8937499999999999 | 0 |
| 0.8944444444444444 | 0 |
| 0.8951388888888889 | 0 |
| 0.8958333333333334 | 0 |
| 0.8965277777777777 | 0 |
| 0.8972222222222223 | 0 |
| 0.8979166666666667 | 0 |
| 0.8986111111111111 | 0 |
| 0.8993055555555555 | 0 |
| 0.9 | 0 |
| 0.9006944444444445 | 0 |
| 0.9013888888888889 | 0 |
| 0.9020833333333332 | 0 |
| 0.9027777777777778 | 0 |
| 0.9034722222222222 | 0 |
| 0.9041666666666667 | 0 |
| 0.904861111111111 | 0 |
| 0.9055555555555556 | 0 |
| 0.90625 | 0 |
| 0.9069444444444444 | 0 |
| 0.907638888888889 | 0 |
| 0.9083333333333333 | 0 |
| 0.9090277777777778 | 0 |
| 0.9097222222222222 | 0 |
| 0.9104166666666668 | 0 |
| 0.9111111111111111 | 0 |
| 0.9118055555555555 | 0 |
| 0.9125 | 0 |
| 0.9131944444444445 | 0 |
| 0.9138888888888889 | 0 |
| 0.9145833333333333 | 0 |
| 0.9152777777777777 | 0 |
| 0.9159722222222223 | 0 |
| 0.9166666666666666 | 0 |
| 0.9173611111111111 | 0 |
| 0.9180555555555556 | 0 |
| 0.9187500000000001 | 0 |
| 0.9194444444444444 | 0 |
| 0.9201388888888888 | 0 |
| 0.9208333333333334 | 0 |
| 0.9215277777777778 | 0 |
| 0.9222222222222222 | 0 |
| 0.9229166666666666 | 0 |
| 0.9236111111111112 | 0 |
| 0.9243055555555556 | 0 |
| 0.9249999999999999 | 0 |
| 0.9256944444444444 | 0 |
| 0.9263888888888889 | 0 |
| 0.9270833333333334 | 0 |
| 0.9277777777777777 | 0 |
| 0.9284722222222223 | 0 |
| 0.9291666666666667 | 0 |
| 0.9298611111111111 | 0 |
| 0.9305555555555555 | 0 |
| 0.93125 | 0 |
| 0.9319444444444445 | 0 |
| 0.9326388888888889 | 0 |
| 0.9333333333333332 | 0 |
| 0.9340277777777778 | 0 |
| 0.9347222222222222 | 0 |
| 0.9354166666666667 | 0 |
| 0.936111111111111 | 0 |
| 0.9368055555555556 | 0 |
| 0.9375 | 0 |
| 0.9381944444444444 | 0 |
| 0.938888888888889 | 0 |
| 0.9395833333333333 | 0 |
| 0.9402777777777778 | 0 |
| 0.9409722222222222 | 0 |
| 0.9416666666666668 | 0 |
| 0.9423611111111111 | 0 |
| 0.9430555555555555 | 0 |
| 0.94375 | 0 |
| 0.9444444444444445 | 0 |
| 0.9451388888888889 | 0 |
| 0.9458333333333333 | 0 |
| 0.9465277777777777 | 0 |
| 0.9472222222222223 | 0 |
| 0.9479166666666666 | 0 |
| 0.9486111111111111 | 0 |
| 0.9493055555555556 | 0 |
| 0.9500000000000001 | 0 |
| 0.9506944444444444 | 0 |
| 0.9513888888888888 | 0 |
| 0.9520833333333334 | 0 |
| 0.9527777777777778 | 0 |
| 0.9534722222222222 | 0 |
| 0.9541666666666666 | 0 |
| 0.9548611111111112 | 0 |
| 0.9555555555555556 | 0 |
| 0.9562499999999999 | 0 |
| 0.9569444444444444 | 0 |
| 0.9576388888888889 | 0 |
| 0.9583333333333334 | 0 |
| 0.9590277777777777 | 0 |
| 0.9597222222222223 | 0 |
| 0.9604166666666667 | 0 |
| 0.9611111111111111 | 0 |
| 0.9618055555555555 | 0 |
| 0.9625 | 0 |
| 0.9631944444444445 | 0 |
| 0.9638888888888889 | 0 |
| 0.9645833333333332 | 0 |
| 0.9652777777777778 | 0 |
| 0.9659722222222222 | 0 |
| 0.9666666666666667 | 0 |
| 0.967361111111111 | 0 |
| 0.9680555555555556 | 0 |
| 0.96875 | 0 |
| 0.9694444444444444 | 0 |
| 0.970138888888889 | 0 |
| 0.9708333333333333 | 0 |
| 0.9715277777777778 | 0 |
| 0.9722222222222222 | 0 |
| 0.9729166666666668 | 0 |
| 0.9736111111111111 | 0 |
| 0.9743055555555555 | 0 |
| 0.975 | 0 |
| 0.9756944444444445 | 0 |
| 0.9763888888888889 | 0 |
| 0.9770833333333333 | 0 |
| 0.9777777777777777 | 0 |
| 0.9784722222222223 | 0 |
| 0.9791666666666666 | 0 |
| 0.9798611111111111 | 0 |
| 0.9805555555555556 | 0 |
| 0.9812500000000001 | 0 |
| 0.9819444444444444 | 0 |
| 0.9826388888888888 | 0 |
| 0.9833333333333334 | 0 |
| 0.9840277777777778 | 0 |
| 0.9847222222222222 | 0 |
| 0.9854166666666666 | 0 |
| 0.9861111111111112 | 0 |
| 0.9868055555555556 | 0 |
| 0.9874999999999999 | 0 |
| 0.9881944444444444 | 0 |
| 0.9888888888888889 | 0 |
| 0.9895833333333334 | 0 |
| 0.9902777777777777 | 0 |
| 0.9909722222222223 | 0 |
| 0.9916666666666667 | 0 |
| 0.9923611111111111 | 0 |
| 0.9930555555555555 | 0 |
| 0.99375 | 0 |
| 0.9944444444444445 | 0 |
| 0.9951388888888889 | 0 |
| 0.9958333333333332 | 0 |
| 0.9965277777777778 | 0 |
| 0.9972222222222222 | 0 |
| 0.9979166666666667 | 0 |
| 0.998611111111111 | 0 |
| 0.9993055555555556 | 0 |